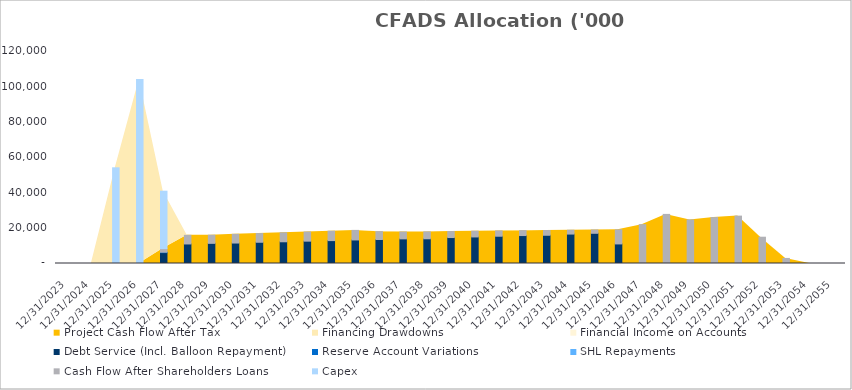
| Category | Debt Service (Incl. Balloon Repayment) | Reserve Account Variations | SHL Repayments | Cash Flow After Shareholders Loans | Capex |
|---|---|---|---|---|---|
| 12/31/23 | 0 | 0 | 0 | 0 | 0 |
| 12/31/24 | 0 | 0 | 0 | 0 | 0 |
| 12/31/25 | 0 | 0 | 0 | 0 | 54163.221 |
| 12/31/26 | 0 | 0 | 0 | 0 | 104126.749 |
| 12/31/27 | 6126.216 | 257.487 | 0 | 2051.712 | 32493.425 |
| 12/31/28 | 11061.052 | 0 | 0 | 4883.852 | 0 |
| 12/31/29 | 11404.723 | 0 | 0 | 4604.562 | 0 |
| 12/31/30 | 11581.695 | 0 | 0 | 4926.2 | 0 |
| 12/31/31 | 12022.029 | 0 | 0 | 4927.291 | 0 |
| 12/31/32 | 12295.527 | 0 | 0 | 5084.872 | 0 |
| 12/31/33 | 12647.145 | 0 | 0 | 5171.005 | 0 |
| 12/31/34 | 12962.176 | 0 | 0 | 5312.875 | 0 |
| 12/31/35 | 13330.89 | 0 | 0 | 5407.99 | 0 |
| 12/31/36 | 13578.914 | 0 | 0 | 4470.789 | 0 |
| 12/31/37 | 13941.457 | 0 | 0 | 3887.836 | 0 |
| 12/31/38 | 13989.483 | 0 | 0 | 3907.562 | 0 |
| 12/31/39 | 14690.055 | 0 | 0 | 3399.503 | 0 |
| 12/31/40 | 15029.321 | 0 | 0 | 3261.913 | 0 |
| 12/31/41 | 15435.681 | 0 | 0 | 3007.551 | 0 |
| 12/31/42 | 15823.428 | 0 | 0 | 2786.759 | 0 |
| 12/31/43 | 15984.44 | 0 | 0 | 2678.949 | 0 |
| 12/31/44 | 16656.471 | 0 | 0 | 2174.871 | 0 |
| 12/31/45 | 17096.739 | 0 | 0 | 1886.314 | 0 |
| 12/31/46 | 11079.547 | 0 | 0 | 7978.011 | 0 |
| 12/31/47 | 2.117 | 0 | 0 | 21982.035 | 0 |
| 12/31/48 | 0 | 0 | 0 | 27795.724 | 0 |
| 12/31/49 | 0 | 0 | 0 | 24679.955 | 0 |
| 12/31/50 | 0 | 0 | 0 | 25991.022 | 0 |
| 12/31/51 | 0 | 0 | 0 | 26825.501 | 0 |
| 12/31/52 | 0 | 257.487 | 0 | 14624.827 | 0 |
| 12/31/53 | 0 | 0 | 0 | 2866.49 | 0 |
| 12/31/54 | 0 | 0 | 0 | 0 | 0 |
| 12/31/55 | 0 | 0 | 0 | 0 | 0 |
| 12/31/56 | 0 | 0 | 0 | 0 | 0 |
| 12/31/57 | 0 | 0 | 0 | 0 | 0 |
| 12/31/58 | 0 | 0 | 0 | 0 | 0 |
| 12/31/59 | 0 | 0 | 0 | 0 | 0 |
| 12/31/60 | 0 | 0 | 0 | 0 | 0 |
| 12/31/61 | 0 | 0 | 0 | 0 | 0 |
| 12/31/62 | 0 | 0 | 0 | 0 | 0 |
| 12/31/63 | 0 | 0 | 0 | 0 | 0 |
| 12/31/64 | 0 | 0 | 0 | 0 | 0 |
| 12/31/65 | 0 | 0 | 0 | 0 | 0 |
| 12/31/66 | 0 | 0 | 0 | 0 | 0 |
| 12/31/67 | 0 | 0 | 0 | 0 | 0 |
| 12/31/68 | 0 | 0 | 0 | 0 | 0 |
| 12/31/69 | 0 | 0 | 0 | 0 | 0 |
| 12/31/70 | 0 | 0 | 0 | 0 | 0 |
| 12/31/71 | 0 | 0 | 0 | 0 | 0 |
| 12/31/72 | 0 | 0 | 0 | 0 | 0 |
| 12/31/73 | 0 | 0 | 0 | 0 | 0 |
| 12/31/74 | 0 | 0 | 0 | 0 | 0 |
| 12/31/75 | 0 | 0 | 0 | 0 | 0 |
| 12/31/76 | 0 | 0 | 0 | 0 | 0 |
| 12/31/77 | 0 | 0 | 0 | 0 | 0 |
| 12/31/78 | 0 | 0 | 0 | 0 | 0 |
| 12/31/79 | 0 | 0 | 0 | 0 | 0 |
| 12/31/80 | 0 | 0 | 0 | 0 | 0 |
| 12/31/81 | 0 | 0 | 0 | 0 | 0 |
| 12/31/82 | 0 | 0 | 0 | 0 | 0 |